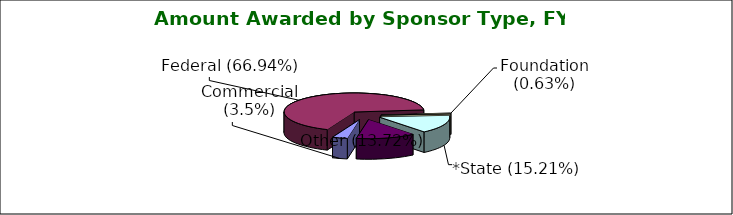
| Category | Series 0 |
|---|---|
| Commercial (3.5%) | 0.035 |
| Federal (66.94%) | 0.669 |
| Foundation (0.63%) | 0.006 |
| *State (15.21%) | 0.152 |
| Other (13.72%) | 0.137 |